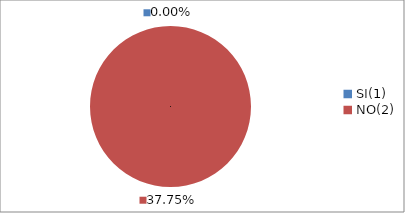
| Category | Series 0 |
|---|---|
| SI(1) | 0 |
| NO(2) | 0.378 |